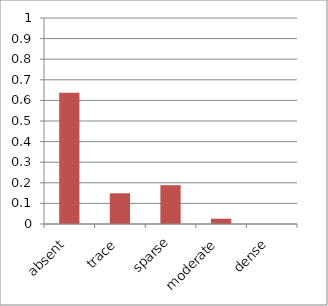
| Category | Ut purp |
|---|---|
| absent | 0.637 |
| trace | 0.149 |
| sparse | 0.188 |
| moderate | 0.026 |
| dense | 0 |